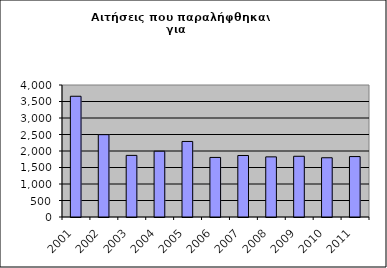
| Category | Series 1 |
|---|---|
| 2001.0 | 3659 |
| 2002.0 | 2495 |
| 2003.0 | 1867 |
| 2004.0 | 1993 |
| 2005.0 | 2289 |
| 2006.0 | 1805 |
| 2007.0 | 1864 |
| 2008.0 | 1822 |
| 2009.0 | 1840 |
| 2010.0 | 1795 |
| 2011.0 | 1831 |